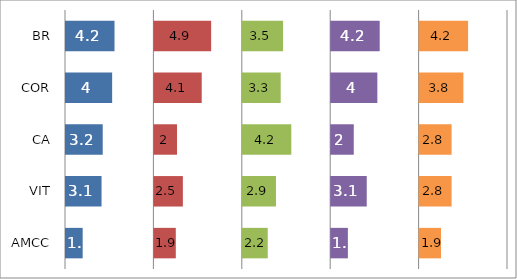
| Category | Segment 1 | Spacer 1 | Segment 2 | Spacer 2 | Segment 3 | Spacer 3 | Segment 4 | Spacer 4 | Segment 5 |
|---|---|---|---|---|---|---|---|---|---|
| BR | 4.2 | 3.3 | 4.9 | 2.6 | 3.5 | 4 | 4.2 | 3.3 | 4.2 |
| COR | 4 | 3.5 | 4.1 | 3.4 | 3.3 | 4.2 | 4 | 3.5 | 3.8 |
| CA | 3.2 | 4.3 | 2 | 5.5 | 4.2 | 3.3 | 2 | 5.5 | 2.8 |
| VIT | 3.1 | 4.4 | 2.5 | 5 | 2.9 | 4.6 | 3.1 | 4.4 | 2.8 |
| AMCC | 1.5 | 6 | 1.9 | 5.6 | 2.2 | 5.3 | 1.5 | 6 | 1.9 |